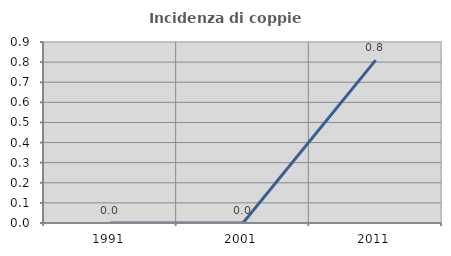
| Category | Incidenza di coppie miste |
|---|---|
| 1991.0 | 0 |
| 2001.0 | 0 |
| 2011.0 | 0.81 |